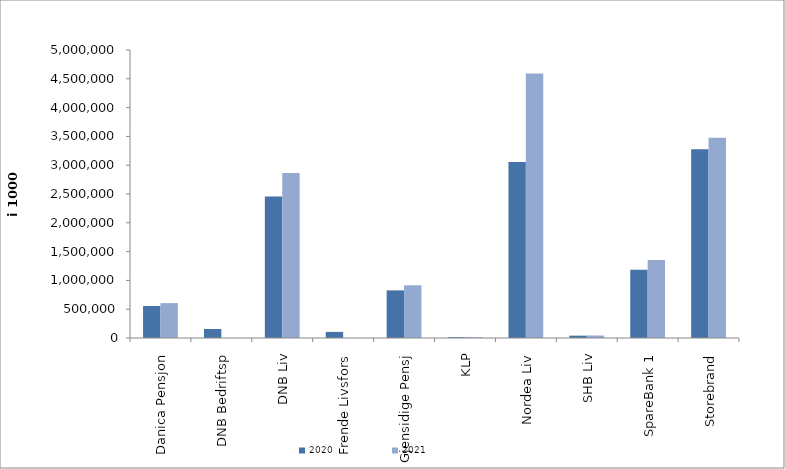
| Category | 2020 | 2021 |
|---|---|---|
| Danica Pensjon | 556076.752 | 605624.357 |
| DNB Bedriftsp | 155790 | 0 |
| DNB Liv | 2457225.304 | 2864053.529 |
| Frende Livsfors | 105771 | 0 |
| Gjensidige Pensj | 826794 | 917875 |
| KLP | 13284.058 | 13768.486 |
| Nordea Liv | 3056093.779 | 4591987.802 |
| SHB Liv | 40693.551 | 43468.251 |
| SpareBank 1 | 1184786.174 | 1354315.194 |
| Storebrand | 3276242.028 | 3478515.011 |